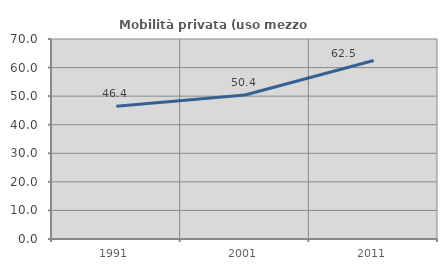
| Category | Mobilità privata (uso mezzo privato) |
|---|---|
| 1991.0 | 46.429 |
| 2001.0 | 50.413 |
| 2011.0 | 62.469 |